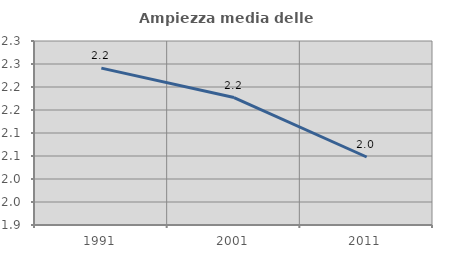
| Category | Ampiezza media delle famiglie |
|---|---|
| 1991.0 | 2.241 |
| 2001.0 | 2.177 |
| 2011.0 | 2.048 |